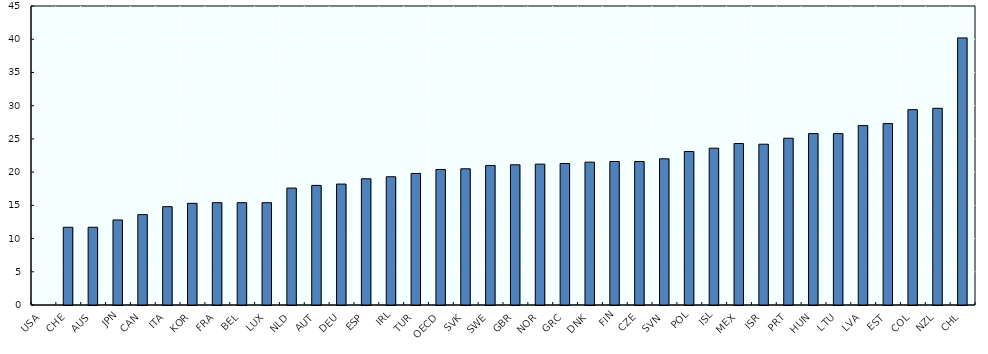
| Category | Series 0 |
|---|---|
| USA | 0 |
| CHE | 11.7 |
| AUS | 11.7 |
| JPN | 12.8 |
| CAN | 13.6 |
| ITA | 14.8 |
| KOR | 15.3 |
| FRA | 15.4 |
| BEL | 15.4 |
| LUX | 15.4 |
| NLD | 17.6 |
| AUT | 18 |
| DEU | 18.2 |
| ESP | 19 |
| IRL | 19.3 |
| TUR | 19.8 |
| OECD | 20.4 |
| SVK | 20.5 |
| SWE | 21 |
| GBR | 21.1 |
| NOR | 21.2 |
| GRC | 21.3 |
| DNK | 21.5 |
| FIN | 21.6 |
| CZE | 21.6 |
| SVN | 22 |
| POL | 23.1 |
| ISL | 23.6 |
| MEX | 24.3 |
| ISR | 24.2 |
| PRT | 25.1 |
| HUN | 25.8 |
| LTU | 25.8 |
| LVA | 27 |
| EST | 27.3 |
| COL | 29.4 |
| NZL | 29.6 |
| CHL | 40.2 |